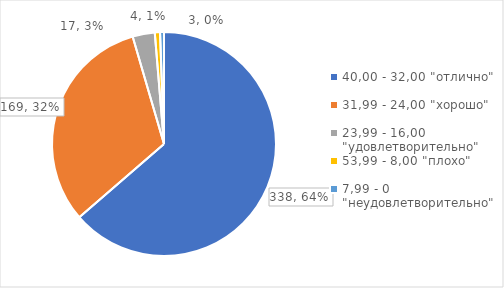
| Category | Series 0 | Series 1 |
|---|---|---|
| 40,00 - 32,00 "отлично" | 338 | 0.637 |
| 31,99 - 24,00 "хорошо" | 169 | 0.318 |
| 23,99 - 16,00 "удовлетворительно" | 17 | 0.032 |
| 53,99 - 8,00 "плохо" | 4 | 0.008 |
| 7,99 - 0 "неудовлетворительно" | 3 | 0.006 |